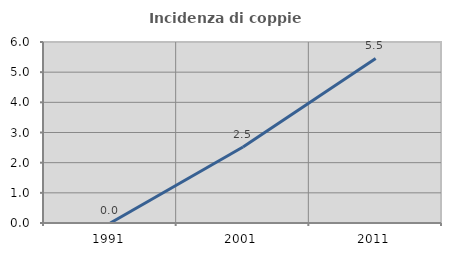
| Category | Incidenza di coppie miste |
|---|---|
| 1991.0 | 0 |
| 2001.0 | 2.521 |
| 2011.0 | 5.455 |